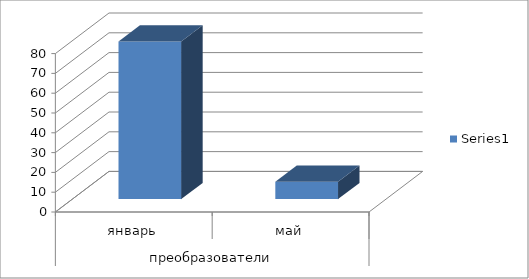
| Category | Series 0 |
|---|---|
| 0 | 1900-03-19 13:05:27 |
| 1 | 1900-01-08 19:12:00 |